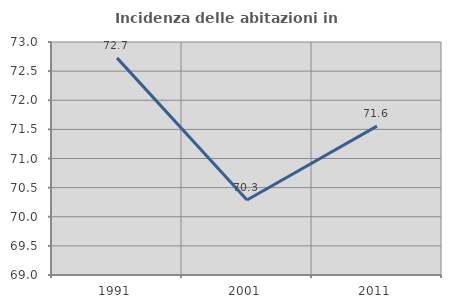
| Category | Incidenza delle abitazioni in proprietà  |
|---|---|
| 1991.0 | 72.727 |
| 2001.0 | 70.288 |
| 2011.0 | 71.556 |